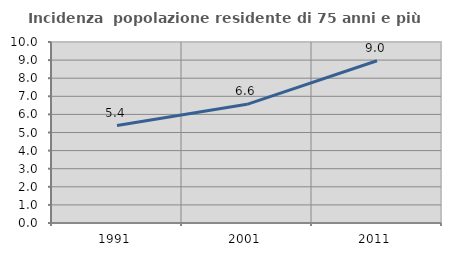
| Category | Incidenza  popolazione residente di 75 anni e più |
|---|---|
| 1991.0 | 5.382 |
| 2001.0 | 6.556 |
| 2011.0 | 8.966 |